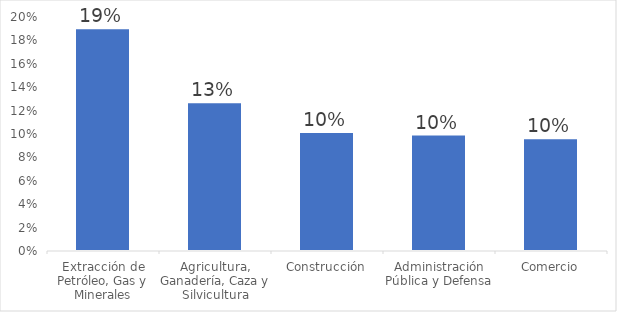
| Category | Series 0 |
|---|---|
| Extracción de Petróleo, Gas y Minerales | 0.19 |
| Agricultura, Ganadería, Caza y Silvicultura | 0.127 |
| Construcción | 0.102 |
| Administración Pública y Defensa | 0.1 |
| Comercio | 0.096 |